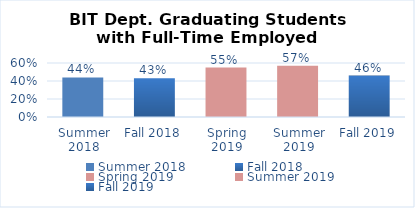
| Category | Series 0 |
|---|---|
| Summer 2018 | 0.44 |
| Fall 2018 | 0.43 |
| Spring 2019 | 0.55 |
| Summer 2019 | 0.57 |
| Fall 2019 | 0.46 |